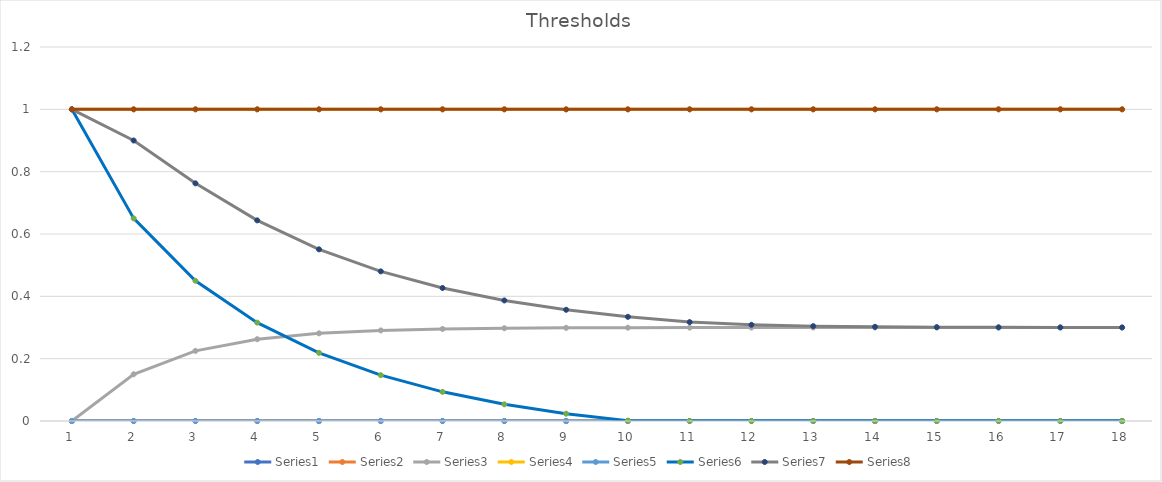
| Category | Series 0 | Series 1 | Series 2 | Series 3 | Series 4 | Series 5 | Series 6 | Series 7 |
|---|---|---|---|---|---|---|---|---|
| 0 | 0 | 0 | 0 | 1 | 0 | 1 | 1 | 1 |
| 1 | 0 | 0 | 0.15 | 1 | 0 | 0.65 | 0.9 | 1 |
| 2 | 0 | 0 | 0.225 | 1 | 0 | 0.45 | 0.763 | 1 |
| 3 | 0 | 0 | 0.262 | 1 | 0 | 0.316 | 0.644 | 1 |
| 4 | 0 | 0 | 0.281 | 1 | 0 | 0.219 | 0.551 | 1 |
| 5 | 0 | 0 | 0.291 | 1 | 0 | 0.147 | 0.48 | 1 |
| 6 | 0 | 0 | 0.295 | 1 | 0 | 0.094 | 0.427 | 1 |
| 7 | 0 | 0 | 0.298 | 1 | 0 | 0.053 | 0.387 | 1 |
| 8 | 0 | 0 | 0.299 | 1 | 0 | 0.023 | 0.357 | 1 |
| 9 | 0 | 0 | 0.299 | 1 | 0 | 0.001 | 0.334 | 1 |
| 10 | 0 | 0 | 0.3 | 1 | 0 | 0 | 0.317 | 1 |
| 11 | 0 | 0 | 0.3 | 1 | 0 | 0 | 0.309 | 1 |
| 12 | 0 | 0 | 0.3 | 1 | 0 | 0 | 0.304 | 1 |
| 13 | 0 | 0 | 0.3 | 1 | 0 | 0 | 0.302 | 1 |
| 14 | 0 | 0 | 0.3 | 1 | 0 | 0 | 0.301 | 1 |
| 15 | 0 | 0 | 0.3 | 1 | 0 | 0 | 0.301 | 1 |
| 16 | 0 | 0 | 0.3 | 1 | 0 | 0 | 0.3 | 1 |
| 17 | 0 | 0 | 0.3 | 1 | 0 | 0 | 0.3 | 1 |